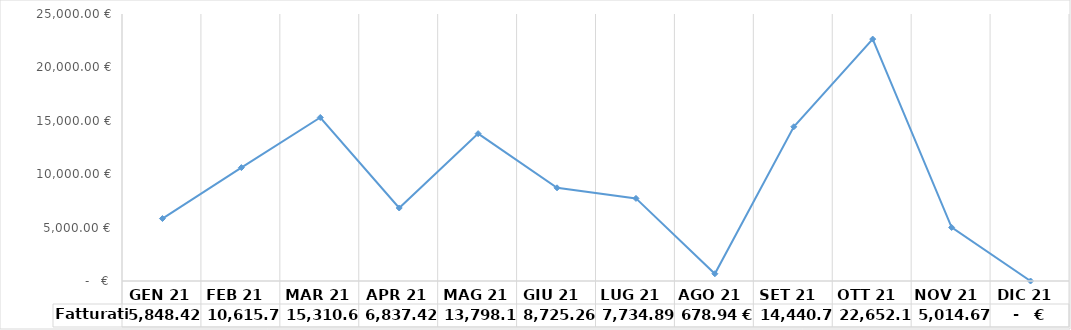
| Category | Fatturati |
|---|---|
|  GEN 21   | 5848.42 |
|  FEB 21   | 10615.74 |
|  MAR 21   | 15310.63 |
|  APR 21   | 6837.42 |
|  MAG 21   | 13798.18 |
| GIU 21  | 8725.26 |
| LUG 21  | 7734.89 |
| AGO 21  | 678.94 |
| SET 21  | 14440.71 |
| OTT 21  | 22652.17 |
| NOV 21  | 5014.67 |
| DIC 21  | 0 |